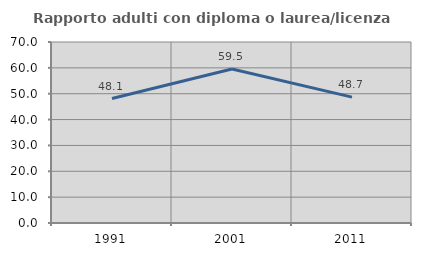
| Category | Rapporto adulti con diploma o laurea/licenza media  |
|---|---|
| 1991.0 | 48.128 |
| 2001.0 | 59.533 |
| 2011.0 | 48.696 |